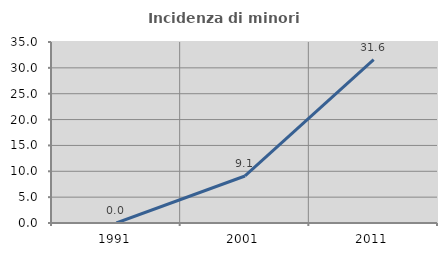
| Category | Incidenza di minori stranieri |
|---|---|
| 1991.0 | 0 |
| 2001.0 | 9.091 |
| 2011.0 | 31.579 |